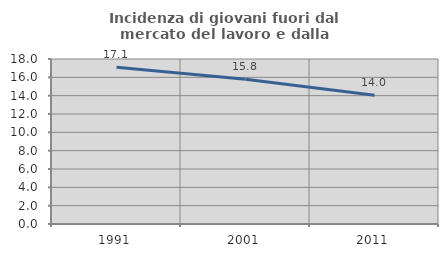
| Category | Incidenza di giovani fuori dal mercato del lavoro e dalla formazione  |
|---|---|
| 1991.0 | 17.094 |
| 2001.0 | 15.789 |
| 2011.0 | 14.035 |